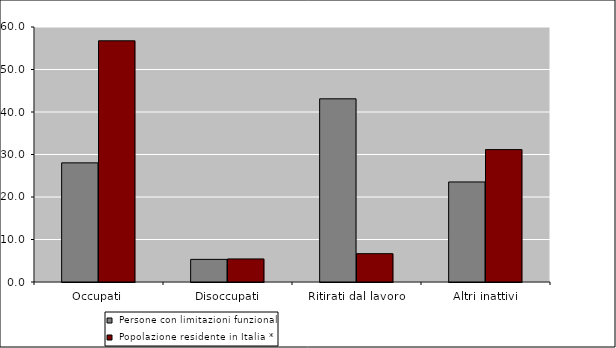
| Category |  Persone con limitazioni funzionali |  Popolazione residente in Italia * |
|---|---|---|
| Occupati | 28.03 | 56.753 |
| Disoccupati | 5.32 | 5.429 |
| Ritirati dal lavoro | 43.1 | 6.668 |
| Altri inattivi | 23.54 | 31.15 |